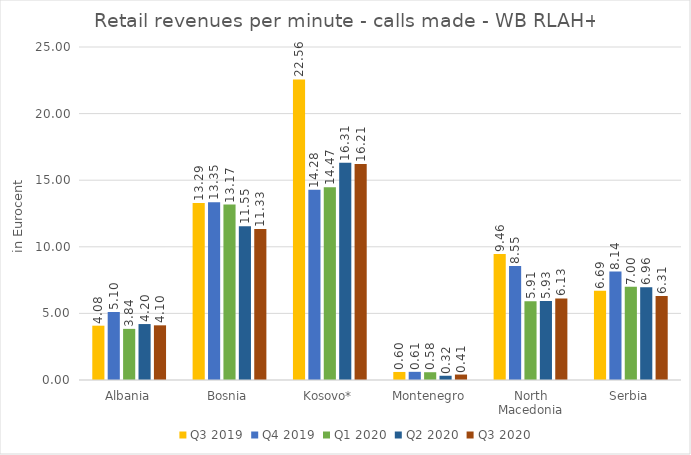
| Category | Q3 2019 | Q4 2019 | Q1 2020 | Q2 2020 | Q3 2020 |
|---|---|---|---|---|---|
| Albania | 4.078 | 5.096 | 3.839 | 4.2 | 4.104 |
| Bosnia | 13.293 | 13.351 | 13.17 | 11.548 | 11.334 |
| Kosovo* | 22.561 | 14.28 | 14.467 | 16.313 | 16.212 |
| Montenegro | 0.604 | 0.614 | 0.583 | 0.318 | 0.409 |
| North Macedonia | 9.456 | 8.55 | 5.914 | 5.929 | 6.126 |
| Serbia | 6.692 | 8.145 | 7.001 | 6.961 | 6.314 |